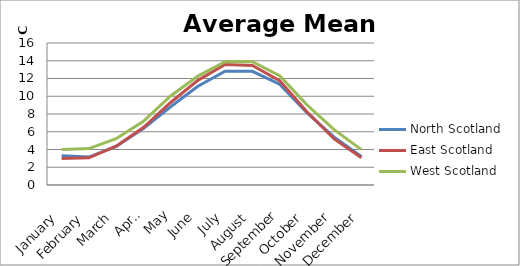
| Category | North Scotland  | East Scotland | West Scotland |
|---|---|---|---|
| January | 3.3 | 2.98 | 4 |
| February | 3.15 | 3.06 | 4.1 |
| March | 4.34 | 4.38 | 5.22 |
| April | 6.37 | 6.48 | 7.18 |
| May | 8.82 | 9.3 | 10.03 |
| June | 11.12 | 11.79 | 12.27 |
| July | 12.83 | 13.57 | 13.9 |
| August | 12.81 | 13.47 | 13.9 |
| September | 11.35 | 11.75 | 12.31 |
| October | 8.16 | 8.25 | 9.04 |
| November | 5.39 | 5.19 | 6.24 |
| December | 3.22 | 3.07 | 3.99 |